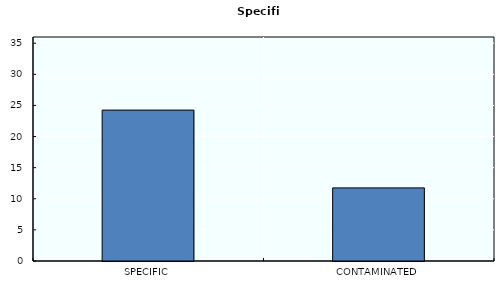
| Category | Specific |
|---|---|
| SPECIFIC | 24.25 |
| CONTAMINATED | 11.75 |